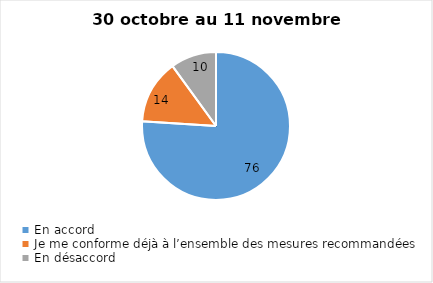
| Category | Series 0 |
|---|---|
| En accord | 76 |
| Je me conforme déjà à l’ensemble des mesures recommandées | 14 |
| En désaccord | 10 |